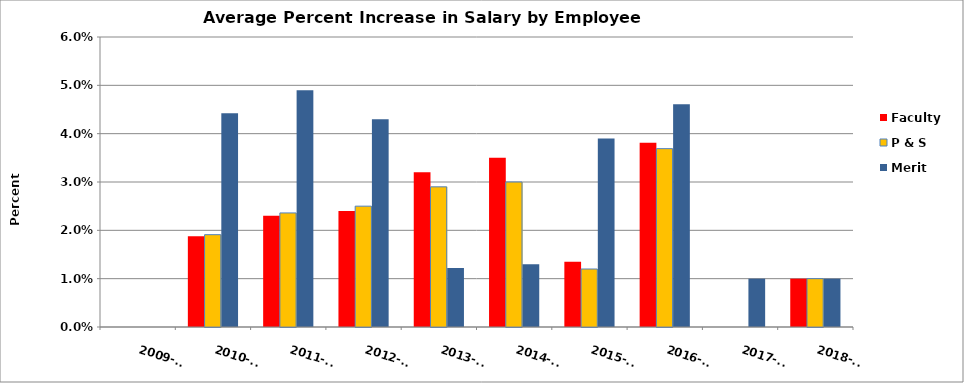
| Category | Faculty | P & S | Merit |
|---|---|---|---|
| 2009-10 | 0 | 0 | 0 |
| 2010-11 | 0.019 | 0.019 | 0.044 |
| 2011-12 | 0.023 | 0.024 | 0.049 |
| 2012-13 | 0.024 | 0.025 | 0.043 |
| 2013-14 | 0.032 | 0.029 | 0.012 |
| 2014-15 | 0.035 | 0.03 | 0.013 |
| 2015-16 | 0.014 | 0.012 | 0.039 |
| 2016-17 | 0.038 | 0.037 | 0.046 |
| 2017-18 | 0 | 0 | 0.01 |
| 2018-19 | 0.01 | 0.01 | 0.01 |